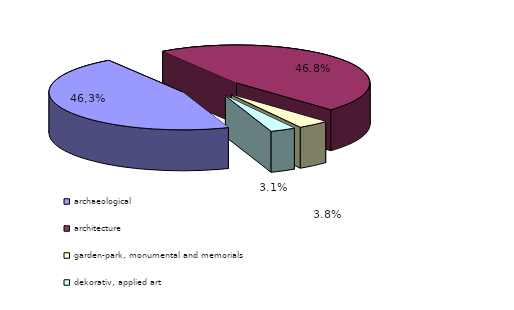
| Category | Series 0 |
|---|---|
| archaeological | 2542 |
| architecture  | 2574 |
| garden-park, monumental and memorials  | 211 |
| dekorativ, applied art   | 169 |